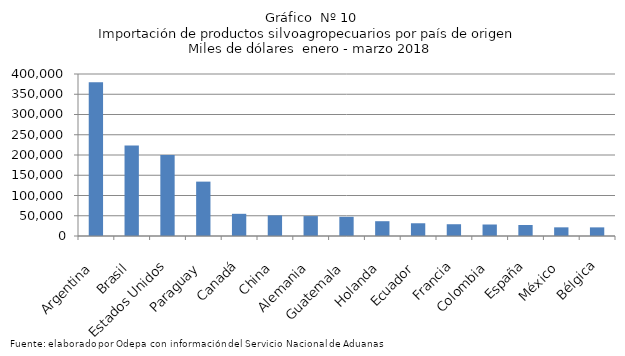
| Category | Series 0 |
|---|---|
| Argentina | 379777.185 |
| Brasil | 223633.026 |
| Estados Unidos | 200054.05 |
| Paraguay | 134255.684 |
| Canadá | 54777.749 |
| China | 50948.751 |
| Alemania | 49199.284 |
| Guatemala | 47387.132 |
| Holanda | 36527.153 |
| Ecuador | 31447.995 |
| Francia | 29059.008 |
| Colombia | 28384.481 |
| España | 27126.115 |
| México | 21384.837 |
| Bélgica | 21297.519 |